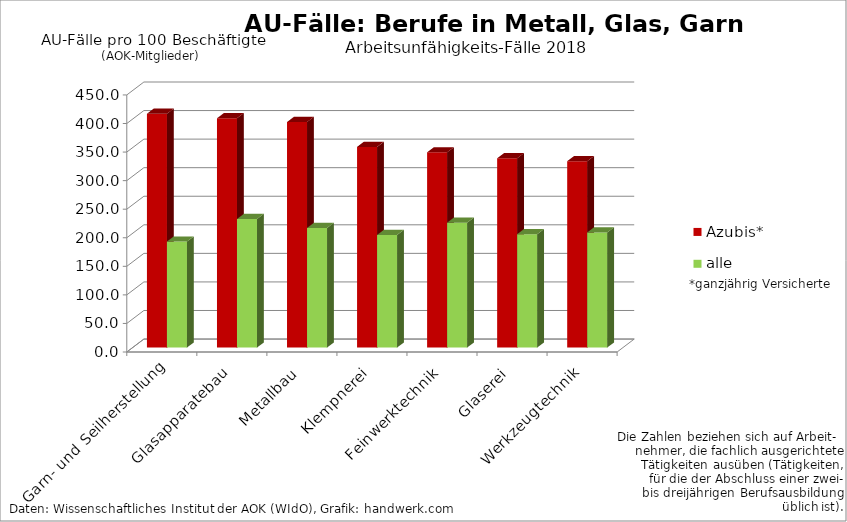
| Category | Azubis* | alle Beschäftigte* |
|---|---|---|
| Garn- und Seilherstellung | 409.405 | 185.598 |
| Glasapparatebau | 401.449 | 225.029 |
| Metallbau | 394.851 | 209.348 |
| Klempnerei | 351.376 | 197.194 |
| Feinwerktechnik | 341.856 | 218.631 |
| Glaserei | 331.394 | 198.52 |
| Werkzeugtechnik | 326.292 | 201.52 |